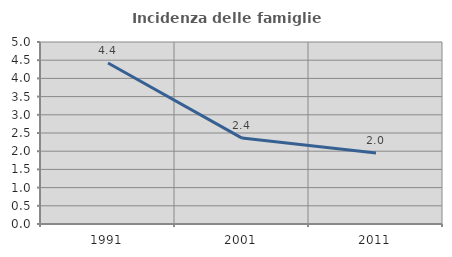
| Category | Incidenza delle famiglie numerose |
|---|---|
| 1991.0 | 4.422 |
| 2001.0 | 2.36 |
| 2011.0 | 1.952 |